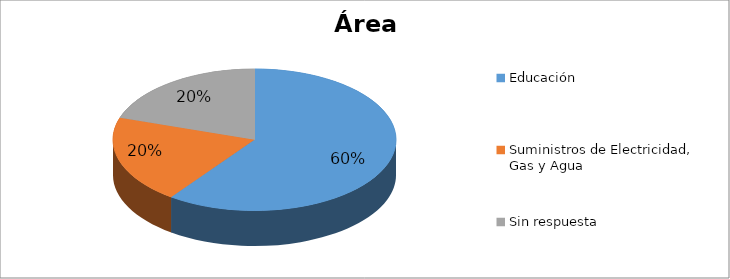
| Category | Series 0 |
|---|---|
| Educación | 0.6 |
| Suministros de Electricidad, Gas y Agua | 0.2 |
| Sin respuesta | 0.2 |